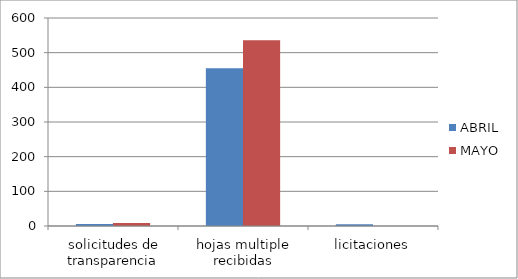
| Category | ABRIL | MAYO |
|---|---|---|
| solicitudes de transparencia | 6 | 9 |
| hojas multiple recibidas | 455 | 536 |
| licitaciones | 5 | 0 |